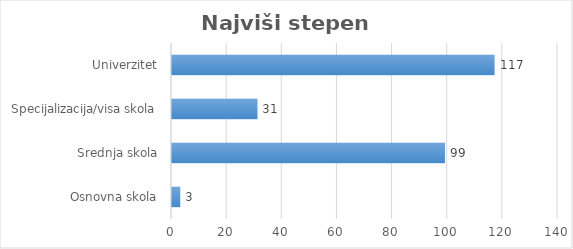
| Category | Najviši stepen obrazovanja |
|---|---|
| Osnovna skola | 3 |
| Srednja skola | 99 |
| Specijalizacija/visa skola | 31 |
| Univerzitet | 117 |